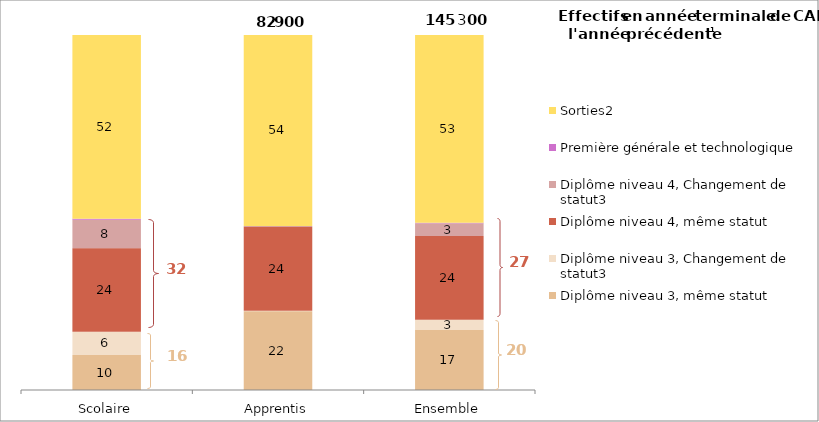
| Category | Diplôme niveau 3, même statut | Diplôme niveau 3, Changement de statut3 | Diplôme niveau 4, même statut | Diplôme niveau 4, Changement de statut3 | Première générale et technologique | Sorties2 |
|---|---|---|---|---|---|---|
| Scolaire | 9.852 | 6.561 | 23.532 | 8.003 | 0.287 | 51.764 |
| Apprentis | 22.181 | 0.113 | 23.725 | 0.171 | 0.019 | 53.787 |
| Ensemble | 16.889 | 2.881 | 23.642 | 3.533 | 0.134 | 52.919 |